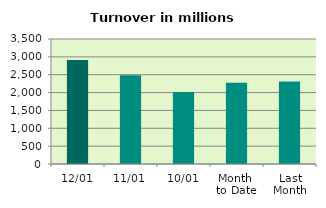
| Category | Series 0 |
|---|---|
| 12/01 | 2914.273 |
| 11/01 | 2485.619 |
| 10/01 | 2017.24 |
| Month 
to Date | 2276.602 |
| Last
Month | 2310.602 |